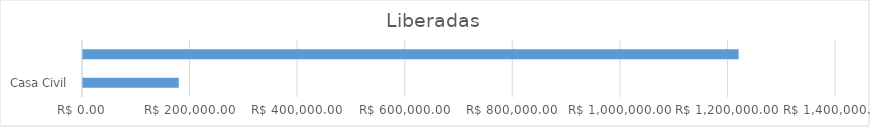
| Category | Series 0 |
|---|---|
| Casa Civil | 177987.52 |